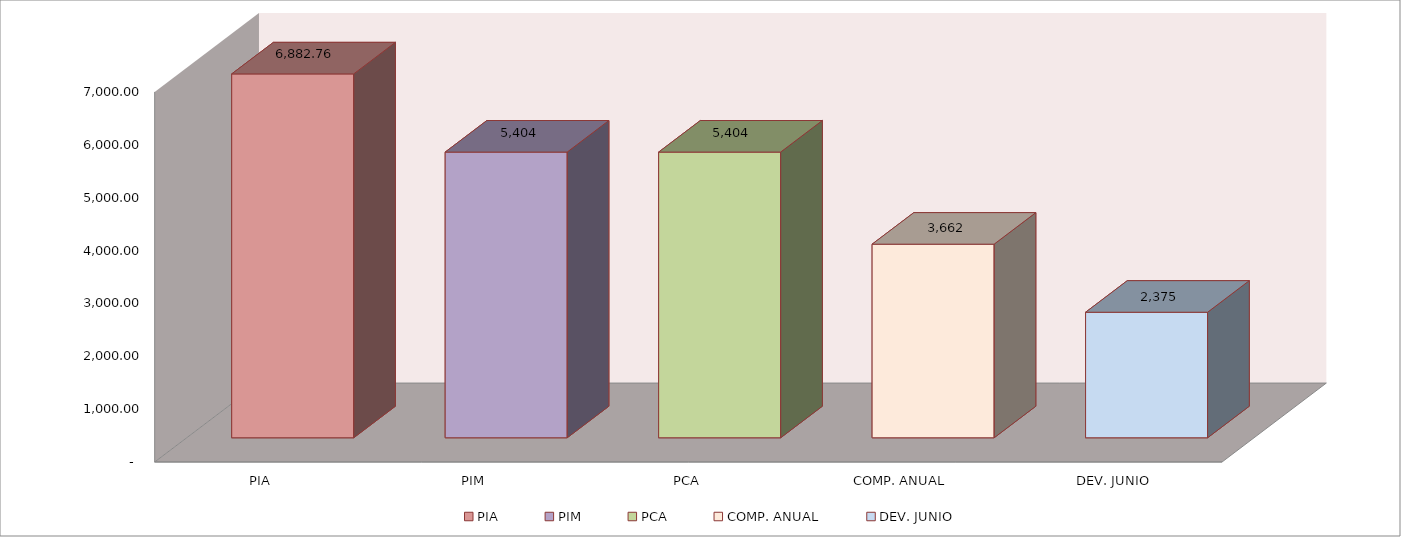
| Category | 011 MINISTERIO DE SALUD |
|---|---|
| PIA | 6882.759 |
| PIM | 5404.083 |
| PCA | 5404.083 |
| COMP. ANUAL | 3662.053 |
| DEV. JUNIO | 2374.748 |